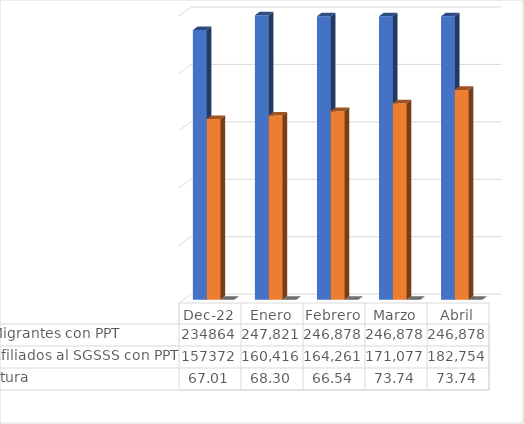
| Category | Nro de Migrantes con PPT  | Nro de Afiliados al SGSSS con PPT | % Cobertura |
|---|---|---|---|
| dic-22 | 234864 | 157372 | 67.006 |
| Enero | 247821 | 160416 | 68.302 |
| Febrero | 246878 | 164261 | 66.535 |
| Marzo | 246878 | 171077 | 73.744 |
| Abril | 246878 | 182754 | 73.744 |